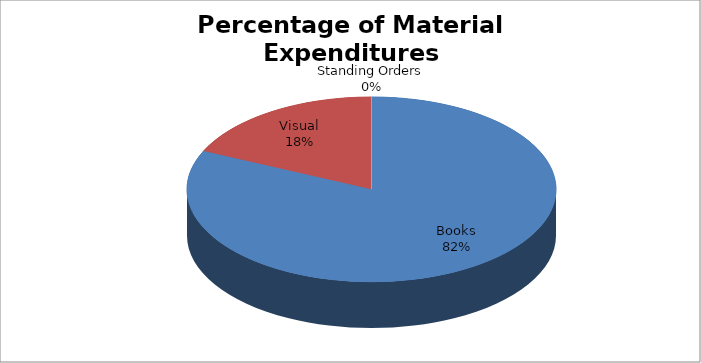
| Category | Series 0 |
|---|---|
| Books | 6554.34 |
| Visual | 1456.87 |
| Standing Orders | 0 |